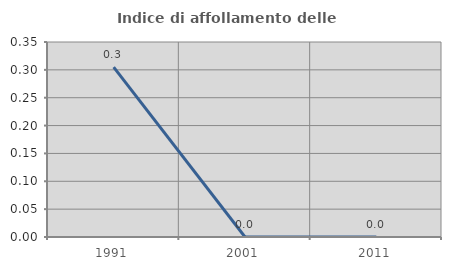
| Category | Indice di affollamento delle abitazioni  |
|---|---|
| 1991.0 | 0.305 |
| 2001.0 | 0 |
| 2011.0 | 0 |